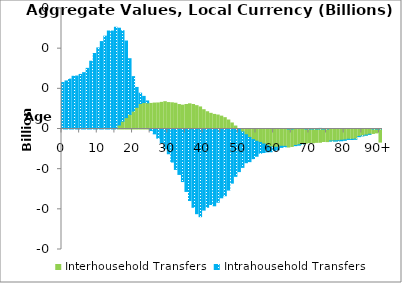
| Category | Interhousehold Transfers | Intrahousehold Transfers |
|---|---|---|
| 0 | 0 | 5.783 |
|  | 0 | 5.984 |
| 2 | 0 | 6.209 |
| 3 | 0 | 6.561 |
| 4 | 0 | 6.594 |
| 5 | 0 | 6.794 |
| 6 | 0 | 7.012 |
| 7 | 0 | 7.55 |
| 8 | 0 | 8.435 |
| 9 | 0 | 9.396 |
| 10 | 0 | 10.091 |
| 11 | 0 | 10.883 |
| 12 | 0 | 11.556 |
| 13 | 0 | 12.197 |
| 14 | 0 | 12.192 |
| 15 | 0 | 12.665 |
| 16 | 0.495 | 12.051 |
| 17 | 0.971 | 11.259 |
| 18 | 1.418 | 9.534 |
| 19 | 1.816 | 6.934 |
| 20 | 2.225 | 4.296 |
| 21 | 2.701 | 2.474 |
| 22 | 3.177 | 1.28 |
| 23 | 3.294 | 0.765 |
| 24 | 3.264 | 0.229 |
| 25 | 3.185 | -0.191 |
| 26 | 3.228 | -0.604 |
| 27 | 3.242 | -1.138 |
| 28 | 3.316 | -1.732 |
| 29 | 3.4 | -2.456 |
| 30 | 3.291 | -3.082 |
| 31 | 3.263 | -4.114 |
| 32 | 3.209 | -5.032 |
| 33 | 3.046 | -5.655 |
| 34 | 2.969 | -6.545 |
| 35 | 3.051 | -7.772 |
| 36 | 3.135 | -8.905 |
| 37 | 3.05 | -9.746 |
| 38 | 2.907 | -10.542 |
| 39 | 2.745 | -10.914 |
| 40 | 2.401 | -10.098 |
| 41 | 2.148 | -9.741 |
| 42 | 1.951 | -9.4 |
| 43 | 1.816 | -9.561 |
| 44 | 1.739 | -9.117 |
| 45 | 1.601 | -8.567 |
| 46 | 1.411 | -8.306 |
| 47 | 1.118 | -7.603 |
| 48 | 0.752 | -6.737 |
| 49 | 0.37 | -5.895 |
| 50 | 0 | -5.303 |
| 51 | -0.373 | -4.404 |
| 52 | -0.717 | -3.48 |
| 53 | -1.05 | -3.014 |
| 54 | -1.317 | -2.373 |
| 55 | -1.524 | -1.867 |
| 56 | -1.676 | -1.338 |
| 57 | -1.868 | -1.062 |
| 58 | -2.053 | -0.796 |
| 59 | -2.229 | -0.603 |
| 60 | -2.282 | -0.395 |
| 61 | -2.265 | -0.323 |
| 62 | -2.151 | -0.14 |
| 63 | -2.162 | -0.055 |
| 64 | -2.247 | 0.042 |
| 65 | -2.172 | 0.021 |
| 66 | -2.05 | -0.022 |
| 67 | -1.961 | -0.048 |
| 68 | -1.842 | -0.039 |
| 69 | -1.758 | 0.005 |
| 70 | -1.686 | 0.008 |
| 71 | -1.71 | 0.029 |
| 72 | -1.663 | 0.046 |
| 73 | -1.65 | 0.074 |
| 74 | -1.559 | 0.031 |
| 75 | -1.57 | 0.018 |
| 76 | -1.489 | -0.013 |
| 77 | -1.474 | -0.028 |
| 78 | -1.456 | -0.053 |
| 79 | -1.401 | -0.064 |
| 80 | -1.356 | -0.05 |
| 81 | -1.276 | -0.019 |
| 82 | -1.282 | -0.028 |
| 83 | -1.243 | -0.029 |
| 84 | -0.936 | -0.018 |
| 85 | -0.84 | -0.008 |
| 86 | -0.757 | -0.012 |
| 87 | -0.655 | -0.004 |
| 88 | -0.554 | 0.003 |
| 89 | -0.486 | 0.006 |
| 90+ | -1.633 | 0.039 |